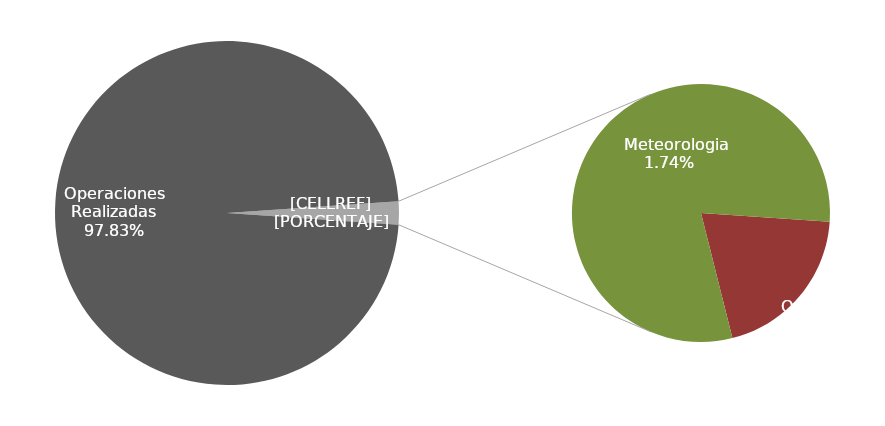
| Category | Series 0 |
|---|---|
| Operaciones Realizadas | 450 |
|    Operaciones Aerolinea | 2 |
|    Mantenimiento Aeronaves | 0 |
|    Otras Imputables | 0 |
|    Meteorologia | 8 |
|    Otras No Imputables | 0 |